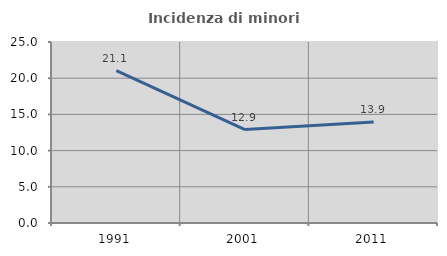
| Category | Incidenza di minori stranieri |
|---|---|
| 1991.0 | 21.053 |
| 2001.0 | 12.903 |
| 2011.0 | 13.934 |